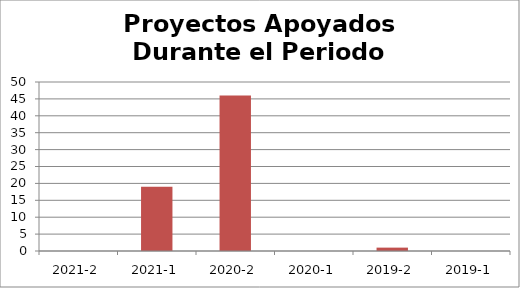
| Category | Proyectos Apoyados Durante el Periodo Semestral |
|---|---|
| 2021-2 | 0 |
| 2021-1 | 19 |
| 2020-2 | 46 |
| 2020-1 | 0 |
| 2019-2 | 1 |
| 2019-1 | 0 |